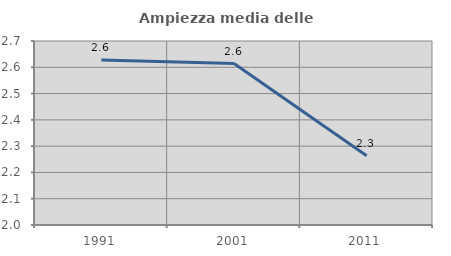
| Category | Ampiezza media delle famiglie |
|---|---|
| 1991.0 | 2.628 |
| 2001.0 | 2.614 |
| 2011.0 | 2.264 |